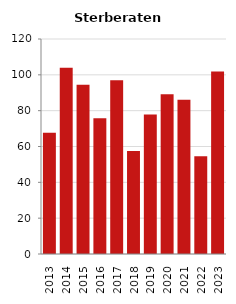
| Category | Sterberate der Bevölkerung ab 80 Jahre (auf Tsd.) |
|---|---|
| 2013.0 | 67.633 |
| 2014.0 | 103.96 |
| 2015.0 | 94.527 |
| 2016.0 | 75.829 |
| 2017.0 | 96.939 |
| 2018.0 | 57.522 |
| 2019.0 | 77.869 |
| 2020.0 | 89.147 |
| 2021.0 | 86.142 |
| 2022.0 | 54.545 |
| 2023.0 | 101.818 |